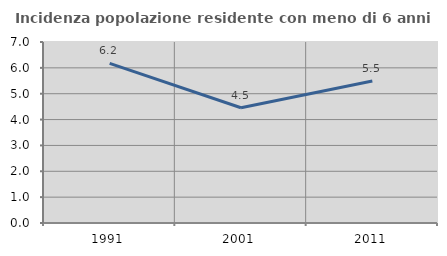
| Category | Incidenza popolazione residente con meno di 6 anni |
|---|---|
| 1991.0 | 6.173 |
| 2001.0 | 4.455 |
| 2011.0 | 5.495 |